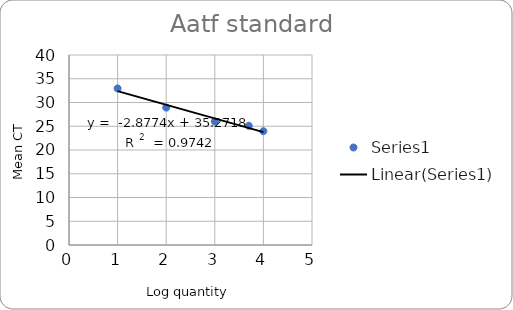
| Category | Series 0 |
|---|---|
| 4.0 | 23.961 |
| 3.698970004336019 | 25.102 |
| 3.0 | 25.999 |
| 2.0 | 28.921 |
| 1.0 | 32.958 |